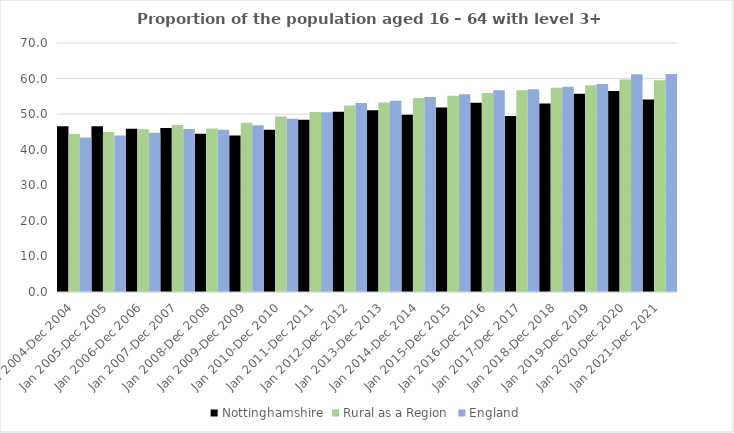
| Category | Nottinghamshire | Rural as a Region | England |
|---|---|---|---|
| Jan 2004-Dec 2004 | 46.6 | 44.405 | 43.4 |
| Jan 2005-Dec 2005 | 46.6 | 44.973 | 44 |
| Jan 2006-Dec 2006 | 45.9 | 45.774 | 44.8 |
| Jan 2007-Dec 2007 | 46.1 | 46.968 | 45.8 |
| Jan 2008-Dec 2008 | 44.5 | 45.964 | 45.6 |
| Jan 2009-Dec 2009 | 44 | 47.59 | 46.9 |
| Jan 2010-Dec 2010 | 45.6 | 49.362 | 48.7 |
| Jan 2011-Dec 2011 | 48.4 | 50.602 | 50.5 |
| Jan 2012-Dec 2012 | 50.7 | 52.439 | 53.1 |
| Jan 2013-Dec 2013 | 51.1 | 53.276 | 53.8 |
| Jan 2014-Dec 2014 | 49.8 | 54.57 | 54.8 |
| Jan 2015-Dec 2015 | 51.9 | 55.16 | 55.6 |
| Jan 2016-Dec 2016 | 53.2 | 55.941 | 56.7 |
| Jan 2017-Dec 2017 | 49.5 | 56.689 | 57 |
| Jan 2018-Dec 2018 | 53 | 57.389 | 57.7 |
| Jan 2019-Dec 2019 | 55.7 | 58.147 | 58.5 |
| Jan 2020-Dec 2020 | 56.5 | 59.771 | 61.2 |
| Jan 2021-Dec 2021 | 54.1 | 59.54 | 61.3 |